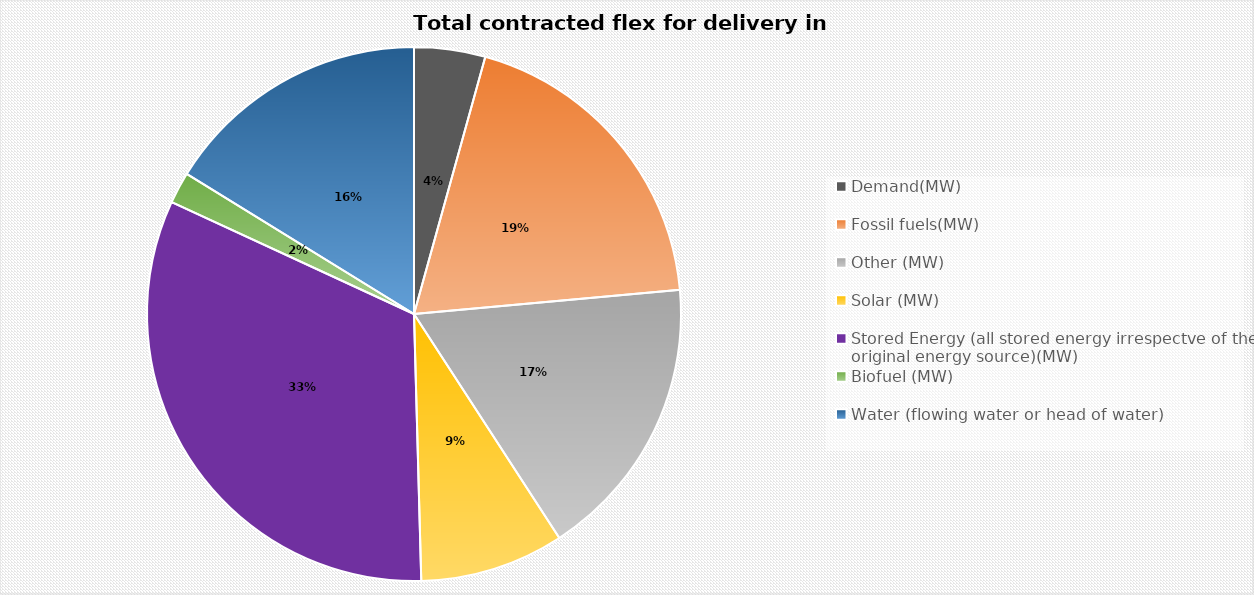
| Category | Total contracted flex for delivery in 22/23 |
|---|---|
| Demand(MW) | 78.933 |
| Fossil fuels(MW) | 353.075 |
| Other (MW) | 316.904 |
| Solar (MW) | 160 |
| Stored Energy (all stored energy irrespectve of the original energy source)(MW) | 592.701 |
| Biofuel (MW) | 34.9 |
| Water (flowing water or head of water) | 297.25 |